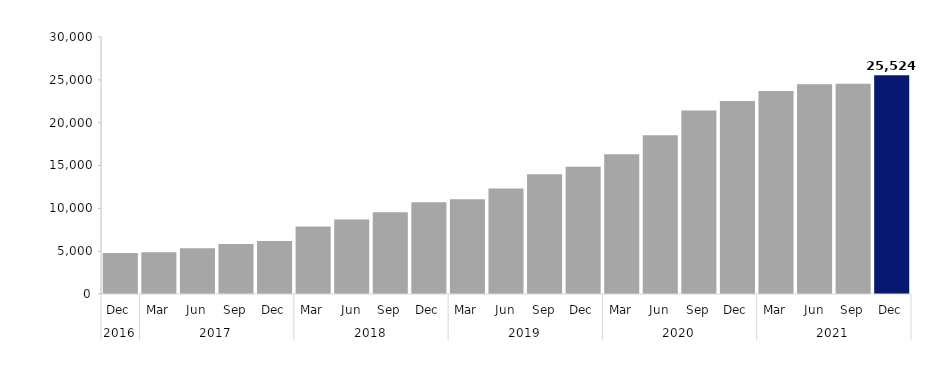
| Category | Series 0 |
|---|---|
| 0 | 4773 |
| 1 | 4866 |
| 2 | 5352 |
| 3 | 5844 |
| 4 | 6180 |
| 5 | 7890 |
| 6 | 8703 |
| 7 | 9537 |
| 8 | 10713 |
| 9 | 11067 |
| 10 | 12309 |
| 11 | 13965 |
| 12 | 14868 |
| 13 | 16308 |
| 14 | 18522 |
| 15 | 21414 |
| 16 | 22521 |
| 17 | 23688 |
| 18 | 24474 |
| 19 | 24546 |
| 20 | 25524 |